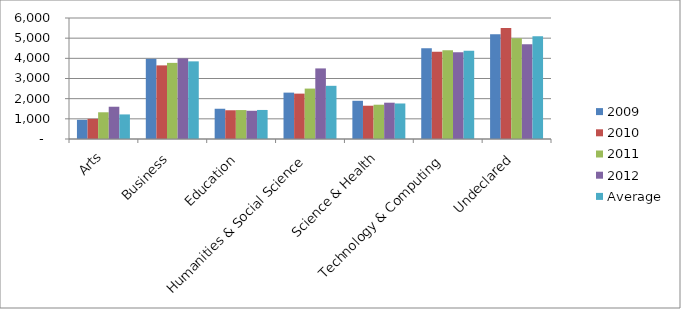
| Category | 2009 | 2010 | 2011 | 2012 | Average |
|---|---|---|---|---|---|
| Arts | 950 | 1000 | 1325 | 1600 | 1218.75 |
| Business | 3975 | 3650 | 3775 | 4000 | 3850 |
| Education | 1500 | 1425 | 1435 | 1400 | 1440 |
| Humanities & Social Science | 2300 | 2250 | 2500 | 3500 | 2637.5 |
| Science & Health | 1895 | 1650 | 1700 | 1800 | 1761.25 |
| Technology & Computing | 4500 | 4325 | 4400 | 4300 | 4381.25 |
| Undeclared | 5200 | 5500 | 5000 | 4700 | 5100 |